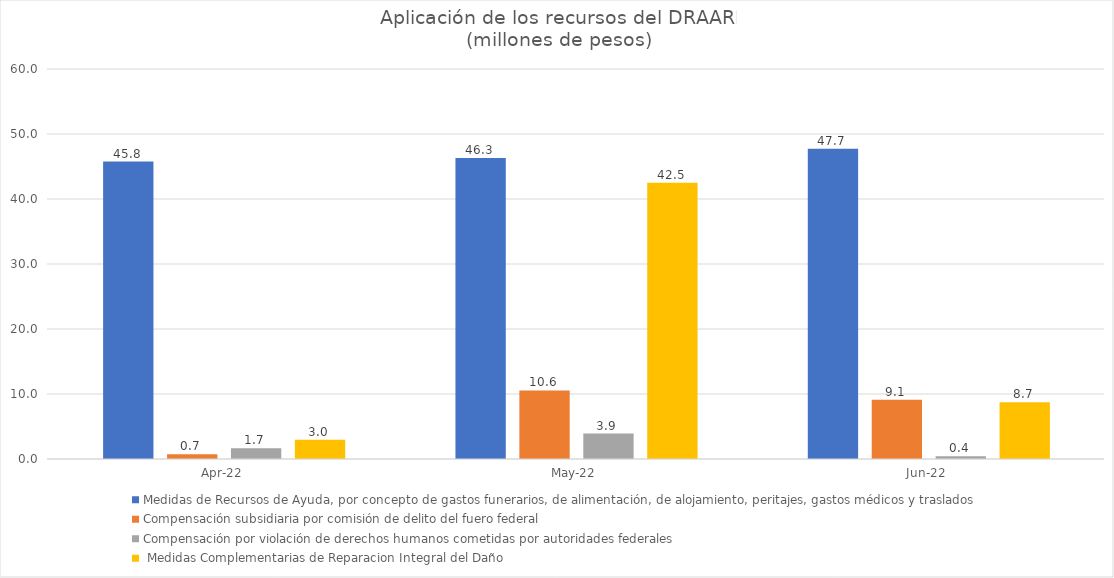
| Category | Medidas de Recursos de Ayuda, por concepto de gastos funerarios, de alimentación, de alojamiento, peritajes, gastos médicos y traslados | Compensación subsidiaria por comisión de delito del fuero federal | Compensación por violación de derechos humanos cometidas por autoridades federales |  Medidas Complementarias de Reparacion Integral del Daño |
|---|---|---|---|---|
| 2022-04-01 | 45.755 | 0.712 | 1.67 | 2.954 |
| 2022-05-01 | 46.312 | 10.553 | 3.905 | 42.503 |
| 2022-06-01 | 47.725 | 9.102 | 0.415 | 8.741 |